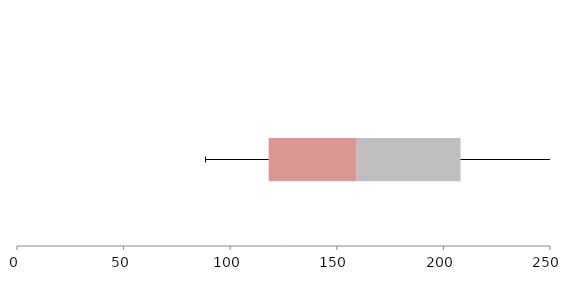
| Category | Series 1 | Series 2 | Series 3 |
|---|---|---|---|
| 0 | 118.057 | 41.258 | 48.706 |